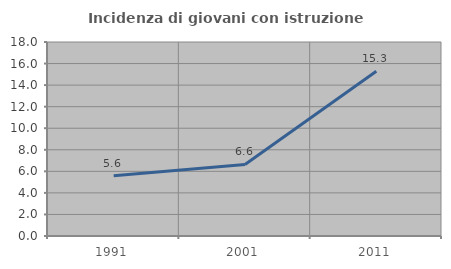
| Category | Incidenza di giovani con istruzione universitaria |
|---|---|
| 1991.0 | 5.584 |
| 2001.0 | 6.641 |
| 2011.0 | 15.294 |